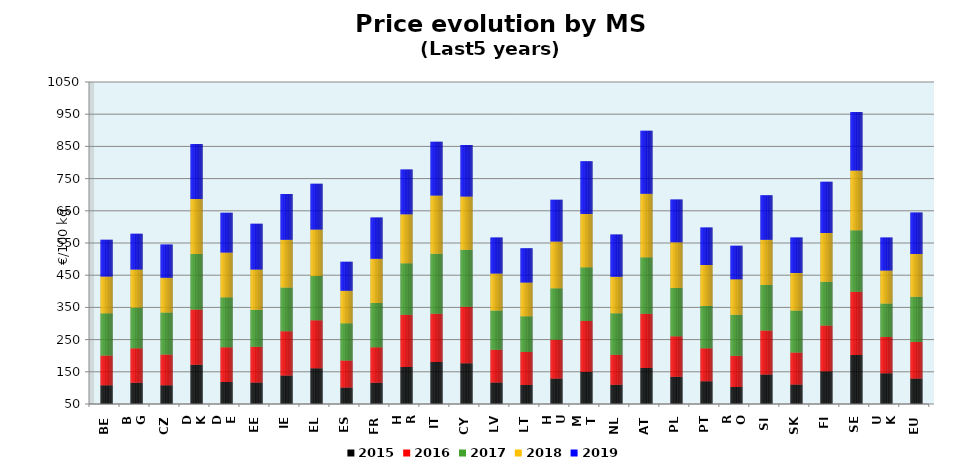
| Category | 2015 | 2016 | 2017 | 2018 | 2019 |
|---|---|---|---|---|---|
| BE | 108.069 | 92.722 | 131.224 | 114.078 | 114.134 |
| BG | 115.638 | 107.636 | 126.407 | 118.162 | 110.546 |
| CZ | 107.863 | 95.755 | 130.247 | 108.404 | 103.25 |
| DK | 171.607 | 171.968 | 172.069 | 171.133 | 171.039 |
| DE | 118.656 | 107.471 | 155.727 | 138.651 | 123.361 |
| EE | 116.648 | 111.047 | 115.044 | 125.065 | 141.996 |
| IE | 138.597 | 137.353 | 136.125 | 148.25 | 141.655 |
| EL | 160.996 | 148.881 | 137.642 | 144.371 | 142.231 |
| ES | 101.066 | 83.914 | 115.536 | 100.842 | 90.55 |
| FR | 116.018 | 110.06 | 137.249 | 138.027 | 128.059 |
| HR | 164.559 | 162.292 | 159.958 | 152.316 | 139.147 |
| IT | 180.182 | 149.98 | 186.507 | 180.998 | 167.107 |
| CY | 176.173 | 176.144 | 176.41 | 165.299 | 160.202 |
| LV | 116.805 | 101.361 | 122.129 | 115.126 | 111.627 |
| LT | 109.287 | 102.444 | 110.888 | 104.355 | 106.392 |
| HU | 129.47 | 120.258 | 159.967 | 145.145 | 129.371 |
| MT | 150.393 | 157.331 | 167.334 | 164.722 | 164.091 |
| NL | 109.929 | 93.075 | 129.048 | 113.141 | 131.24 |
| AT | 161.558 | 168.708 | 175.726 | 196.593 | 196.025 |
| PL | 134.428 | 125.747 | 149.807 | 142.368 | 132.656 |
| PT | 120.493 | 102.688 | 130.915 | 127.377 | 116.497 |
| RO | 102.776 | 97.232 | 127.259 | 110.471 | 103.479 |
| SI | 141.411 | 137.067 | 141.065 | 140.606 | 138.156 |
| SK | 110.906 | 98.946 | 130.453 | 116.234 | 110.631 |
| FI | 151.903 | 141.892 | 135.581 | 151.392 | 159.712 |
| SE | 202.452 | 195.802 | 191.304 | 185.282 | 182.308 |
| UK | 145.22 | 112.585 | 104.431 | 102.593 | 102.37 |
| EU | 128.883 | 113.469 | 140.694 | 132.667 | 128.674 |